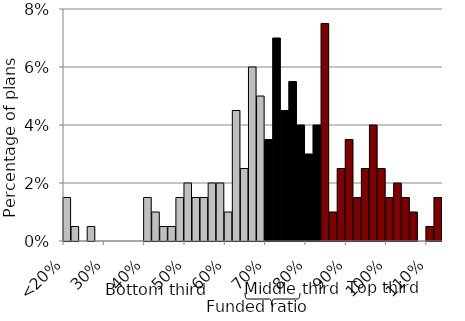
| Category | Series 0 |
|---|---|
| <20% | 0.015 |
|  | 0.005 |
|  | 0 |
|  | 0.005 |
|  | 0 |
| 30% | 0 |
|  | 0 |
|  | 0 |
|  | 0 |
|  | 0 |
| 40% | 0.015 |
|  | 0.01 |
|  | 0.005 |
|  | 0.005 |
|  | 0.015 |
| 50% | 0.02 |
|  | 0.015 |
|  | 0.015 |
|  | 0.02 |
|  | 0.02 |
| 60% | 0.01 |
|  | 0.045 |
|  | 0.025 |
|  | 0.06 |
|  | 0.05 |
| 70% | 0.035 |
|  | 0.07 |
|  | 0.045 |
|  | 0.055 |
|  | 0.04 |
| 80% | 0.03 |
|  | 0.04 |
|  | 0.075 |
|  | 0.01 |
|  | 0.025 |
| 90% | 0.035 |
|  | 0.015 |
|  | 0.025 |
|  | 0.04 |
|  | 0.025 |
| 100% | 0.015 |
|  | 0.02 |
|  | 0.015 |
|  | 0.01 |
|  | 0 |
| 110% | 0.005 |